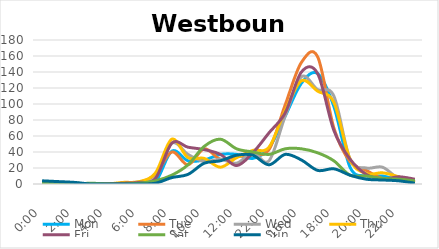
| Category | Mon | Tue | Wed | Thu | Fri | Sat | Sun |
|---|---|---|---|---|---|---|---|
| 0.0 | 0 | 0 | 0 | 3 | 0 | 1 | 4 |
| 0.041667 | 0 | 0 | 1 | 0 | 1 | 2 | 3 |
| 0.083333 | 1 | 0 | 0 | 1 | 0 | 0 | 2 |
| 0.125 | 0 | 0 | 0 | 0 | 0 | 1 | 0 |
| 0.166667 | 0 | 0 | 0 | 0 | 0 | 0 | 0 |
| 0.208333 | 0 | 0 | 0 | 2 | 1 | 0 | 0 |
| 0.25 | 2 | 2 | 3 | 3 | 2 | 1 | 0 |
| 0.291667 | 3 | 12 | 8 | 14 | 7 | 4 | 1 |
| 0.333333 | 41 | 40 | 51 | 56 | 51 | 11 | 8 |
| 0.375 | 29 | 24 | 37 | 33 | 46 | 24 | 12 |
| 0.416667 | 30 | 44 | 28 | 32 | 43 | 47 | 26 |
| 0.458333 | 37 | 31 | 31 | 21 | 37 | 56 | 29 |
| 0.5 | 37 | 34 | 26 | 33 | 23 | 44 | 36 |
| 0.541667 | 32 | 37 | 39 | 42 | 39 | 40 | 36 |
| 1900-01-02 22:00:00 | 45 | 43 | 29 | 46 | 64 | 37 | 24 |
| 0.625 | 85 | 99 | 85 | 92 | 89 | 44 | 37 |
| 0.666667 | 126 | 152 | 134 | 129 | 140 | 44 | 30 |
| 0.708333 | 138 | 159 | 118 | 116 | 138 | 39 | 17 |
| 0.75 | 97 | 70 | 110 | 102 | 67 | 29 | 19 |
| 0.791667 | 21 | 28 | 31 | 31 | 31 | 11 | 11 |
| 0.833333 | 10 | 17 | 20 | 13 | 12 | 10 | 6 |
| 0.875 | 10 | 7 | 21 | 14 | 6 | 7 | 5 |
| 0.916667 | 5 | 8 | 7 | 9 | 9 | 6 | 4 |
| 0.958333 | 3 | 3 | 5 | 2 | 6 | 4 | 1 |